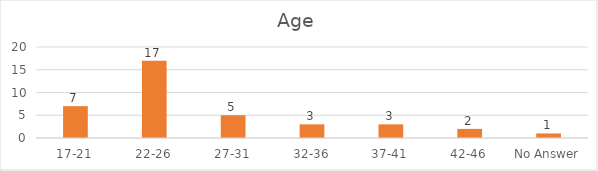
| Category | Age |
|---|---|
| 17-21 | 7 |
| 22-26 | 17 |
| 27-31 | 5 |
| 32-36 | 3 |
| 37-41 | 3 |
| 42-46 | 2 |
| No Answer | 1 |